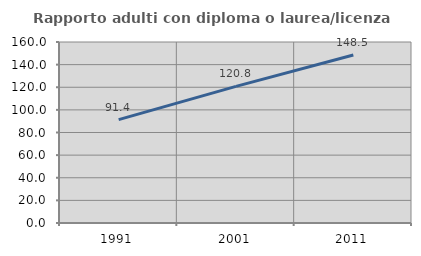
| Category | Rapporto adulti con diploma o laurea/licenza media  |
|---|---|
| 1991.0 | 91.406 |
| 2001.0 | 120.805 |
| 2011.0 | 148.503 |